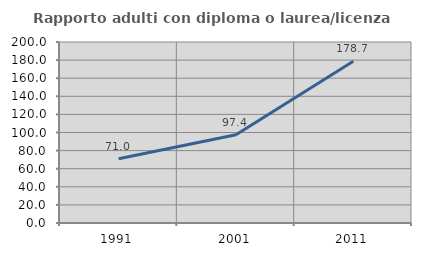
| Category | Rapporto adulti con diploma o laurea/licenza media  |
|---|---|
| 1991.0 | 70.968 |
| 2001.0 | 97.414 |
| 2011.0 | 178.697 |